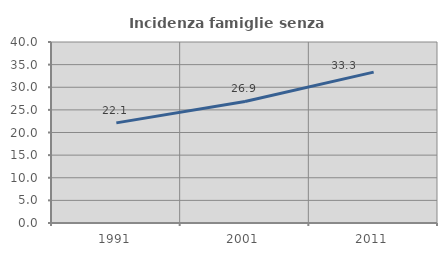
| Category | Incidenza famiglie senza nuclei |
|---|---|
| 1991.0 | 22.127 |
| 2001.0 | 26.854 |
| 2011.0 | 33.342 |